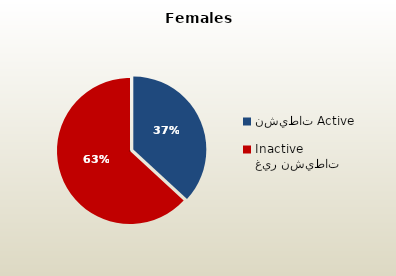
| Category | الاناث القطريات  Qatari Females |
|---|---|
| نشيطات Active | 39556 |
| غير نشيطات Inactive | 67775 |